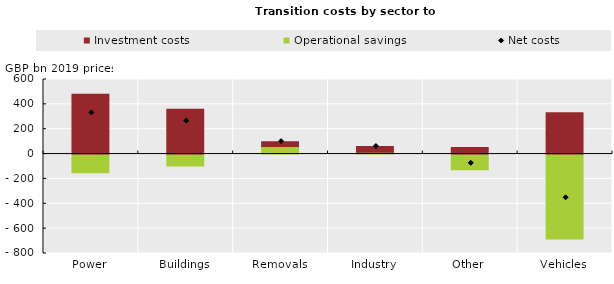
| Category | Operational savings | Investment costs |
|---|---|---|
| Power | -150.084 | 481.217 |
| Buildings | -96.324 | 361.579 |
| Removals | 61 | 39 |
| Industry | 14.977 | 46 |
| Other | -126 | 52 |
| Vehicles | -683.813 | 331.78 |